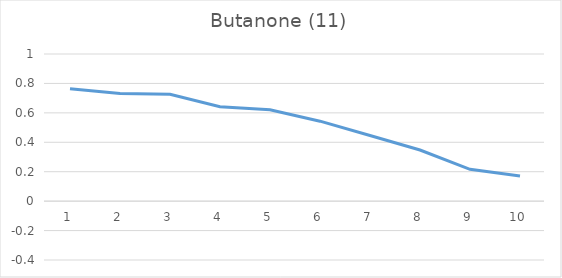
| Category | Series 0 |
|---|---|
| 0 | 0.764 |
| 1 | 0.731 |
| 2 | 0.727 |
| 3 | 0.642 |
| 4 | 0.622 |
| 5 | 0.543 |
| 6 | 0.446 |
| 7 | 0.348 |
| 8 | 0.216 |
| 9 | 0.17 |